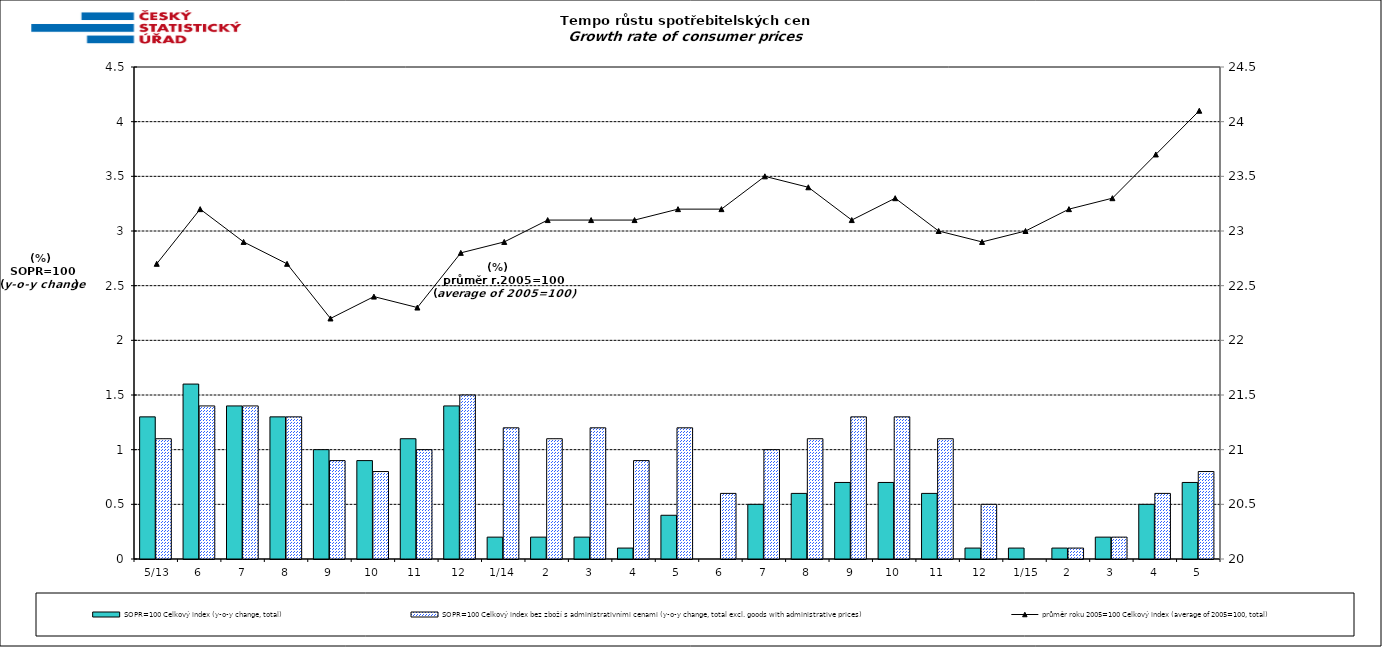
| Category | SOPR=100 Celkový index (y-o-y change, total) | SOPR=100 Celkový index bez zboží s administrativními cenami (y-o-y change, total excl. goods with administrative prices)  |
|---|---|---|
|  5/13 | 1.3 | 1.1 |
| 6 | 1.6 | 1.4 |
| 7 | 1.4 | 1.4 |
| 8 | 1.3 | 1.3 |
| 9 | 1 | 0.9 |
| 10 | 0.9 | 0.8 |
| 11 | 1.1 | 1 |
| 12 | 1.4 | 1.5 |
| 1/14 | 0.2 | 1.2 |
| 2 | 0.2 | 1.1 |
| 3 | 0.2 | 1.2 |
| 4 | 0.1 | 0.9 |
| 5 | 0.4 | 1.2 |
| 6 | 0 | 0.6 |
| 7 | 0.5 | 1 |
| 8 | 0.6 | 1.1 |
| 9 | 0.7 | 1.3 |
| 10 | 0.7 | 1.3 |
| 11 | 0.6 | 1.1 |
| 12 | 0.1 | 0.5 |
|  1/15 | 0.1 | 0 |
| 2 | 0.1 | 0.1 |
| 3 | 0.2 | 0.2 |
| 4 | 0.5 | 0.6 |
| 5 | 0.7 | 0.8 |